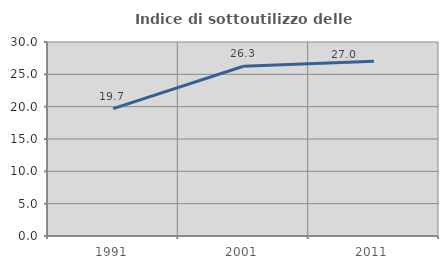
| Category | Indice di sottoutilizzo delle abitazioni  |
|---|---|
| 1991.0 | 19.69 |
| 2001.0 | 26.25 |
| 2011.0 | 27.004 |